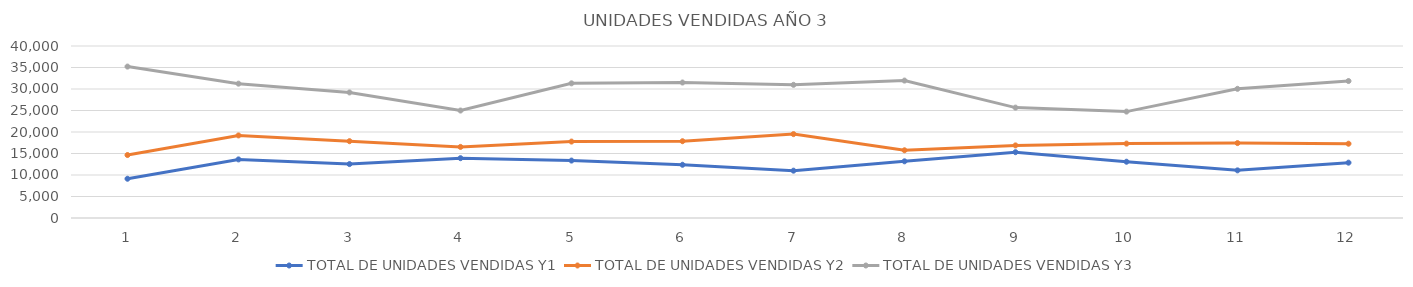
| Category | TOTAL DE UNIDADES VENDIDAS Y1 | TOTAL DE UNIDADES VENDIDAS Y2 | TOTAL DE UNIDADES VENDIDAS Y3 |
|---|---|---|---|
| 0 | 9129 | 14647 | 35215 |
| 1 | 13628 | 19204 | 31243 |
| 2 | 12539 | 17864 | 29198 |
| 3 | 13910 | 16530 | 24992 |
| 4 | 13356 | 17775 | 31314 |
| 5 | 12381 | 17858 | 31508 |
| 6 | 11005 | 19508 | 30973 |
| 7 | 13184 | 15750 | 31959 |
| 8 | 15306 | 16882 | 25671 |
| 9 | 13088 | 17301 | 24743 |
| 10 | 11079 | 17423 | 30043 |
| 11 | 12870 | 17275 | 31855 |